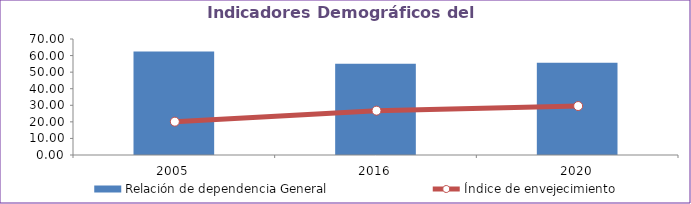
| Category | Relación de dependencia General |
|---|---|
| 2005.0 | 62.429 |
| 2016.0 | 55.12 |
| 2020.0 | 55.714 |